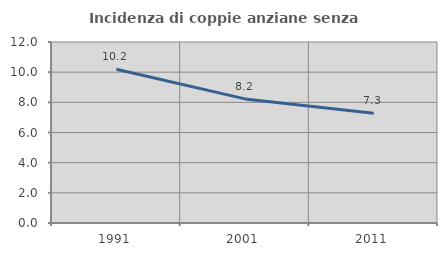
| Category | Incidenza di coppie anziane senza figli  |
|---|---|
| 1991.0 | 10.191 |
| 2001.0 | 8.227 |
| 2011.0 | 7.276 |